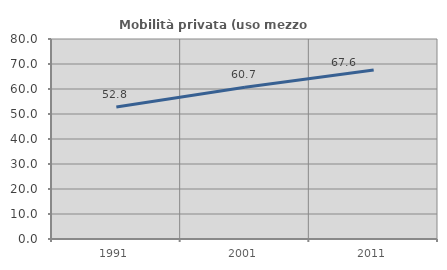
| Category | Mobilità privata (uso mezzo privato) |
|---|---|
| 1991.0 | 52.765 |
| 2001.0 | 60.696 |
| 2011.0 | 67.63 |